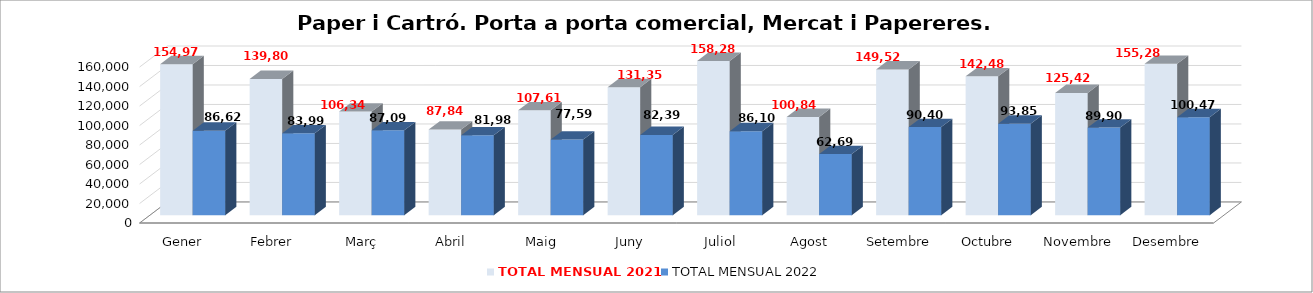
| Category | TOTAL MENSUAL 2021 | TOTAL MENSUAL 2022 |
|---|---|---|
| Gener | 154976 | 86623.8 |
| Febrer | 139800 | 83997.6 |
| Març | 106340 | 87099.2 |
| Abril | 87840 | 81987.391 |
| Maig | 107610 | 77592.6 |
| Juny | 131351.43 | 82393.2 |
| Juliol | 158280 | 86102.8 |
| Agost | 100841 | 62690.27 |
| Setembre | 149520 | 90406.5 |
| Octubre | 142480 | 93854.1 |
| Novembre | 125420 | 89906.35 |
| Desembre | 155280 | 100477.7 |